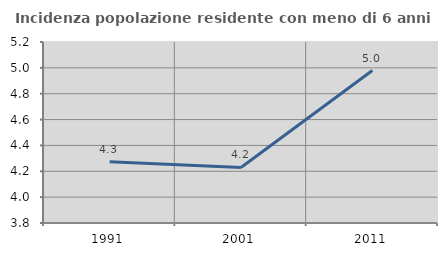
| Category | Incidenza popolazione residente con meno di 6 anni |
|---|---|
| 1991.0 | 4.274 |
| 2001.0 | 4.23 |
| 2011.0 | 4.979 |